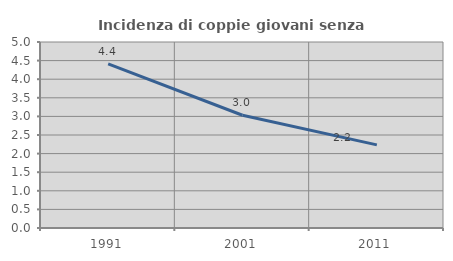
| Category | Incidenza di coppie giovani senza figli |
|---|---|
| 1991.0 | 4.412 |
| 2001.0 | 3.03 |
| 2011.0 | 2.235 |